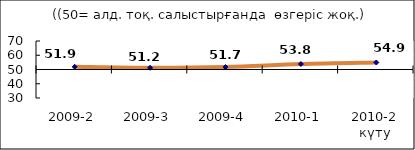
| Category | Диф.индекс ↓ |
|---|---|
| 2009-2 | 51.895 |
| 2009-3 | 51.195 |
| 2009-4 | 51.725 |
| 2010-1 | 53.83 |
| 2010-2 күту | 54.92 |